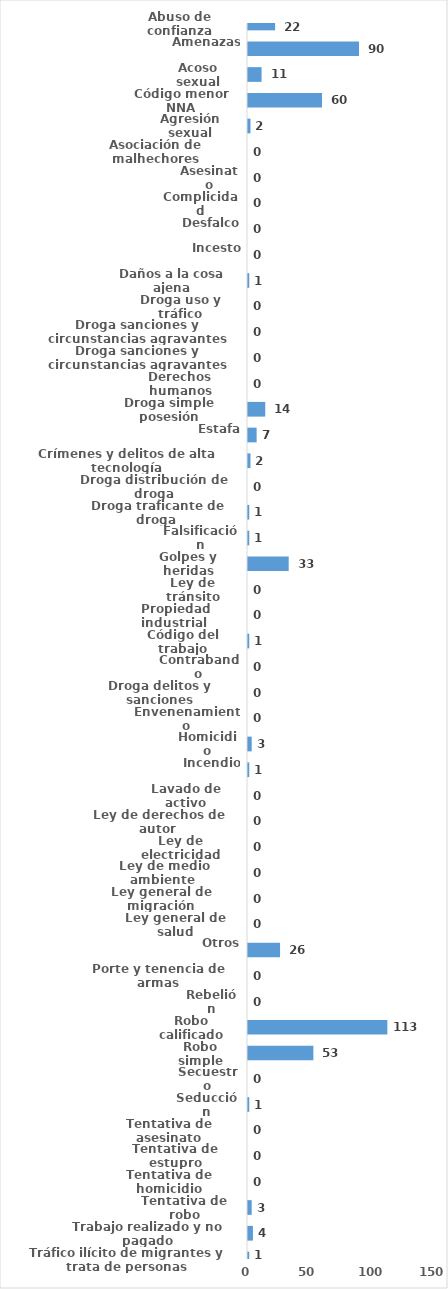
| Category | Series 0 |
|---|---|
| Abuso de confianza | 22 |
| Amenazas | 90 |
| Acoso sexual | 11 |
| Código menor NNA | 60 |
| Agresión sexual | 2 |
| Asociación de malhechores | 0 |
| Asesinato | 0 |
| Complicidad | 0 |
| Desfalco | 0 |
| Incesto | 0 |
| Daños a la cosa ajena | 1 |
| Droga uso y tráfico | 0 |
| Droga sanciones y circunstancias agravantes | 0 |
| Droga sanciones y circunstancias agravantes | 0 |
| Derechos humanos | 0 |
| Droga simple posesión | 14 |
| Estafa | 7 |
| Crímenes y delitos de alta tecnología | 2 |
| Droga distribución de droga | 0 |
| Droga traficante de droga  | 1 |
| Falsificación | 1 |
| Golpes y heridas | 33 |
| Ley de tránsito | 0 |
| Propiedad industrial  | 0 |
| Código del trabajo | 1 |
| Contrabando | 0 |
| Droga delitos y sanciones | 0 |
| Envenenamiento | 0 |
| Homicidio | 3 |
| Incendio | 1 |
| Lavado de activo | 0 |
| Ley de derechos de autor  | 0 |
| Ley de electricidad | 0 |
| Ley de medio ambiente  | 0 |
| Ley general de migración | 0 |
| Ley general de salud | 0 |
| Otros | 26 |
| Porte y tenencia de armas | 0 |
| Rebelión | 0 |
| Robo calificado | 113 |
| Robo simple | 53 |
| Secuestro | 0 |
| Seducción | 1 |
| Tentativa de asesinato | 0 |
| Tentativa de estupro | 0 |
| Tentativa de homicidio | 0 |
| Tentativa de robo | 3 |
| Trabajo realizado y no pagado | 4 |
| Tráfico ilícito de migrantes y trata de personas | 1 |